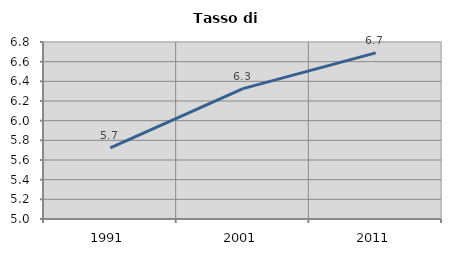
| Category | Tasso di disoccupazione   |
|---|---|
| 1991.0 | 5.722 |
| 2001.0 | 6.326 |
| 2011.0 | 6.689 |